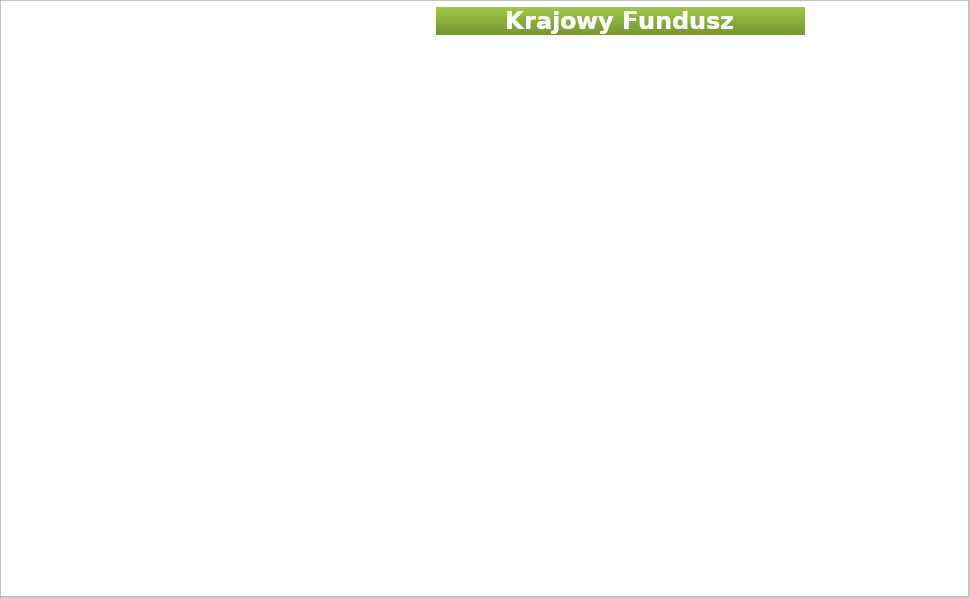
| Category | Finansowanie pracodawcom kosztów kształcenia ustawicznego Wnioski | Finansowanie pracodawcom kosztów kształcenia ustawicznego Otrzymali środki | Uczestnicy działań finansowanych z KFS Liczba pracodawców | Uczestnicy działań finansowanych z KFS Liczba pracowników | Kwota wydatkowanych środków (w tym promocja) |
|---|---|---|---|---|---|
| 2018.0 | 52 | 37 | 16 | 111 | 250000 |
| 2019.0 | 157 | 102 | 29 | 233 | 650000 |
| 2020.0 | 143 | 93 | 29 | 253 | 662000 |
| 2021.0 | 169 | 87 | 37 | 206 | 665000 |